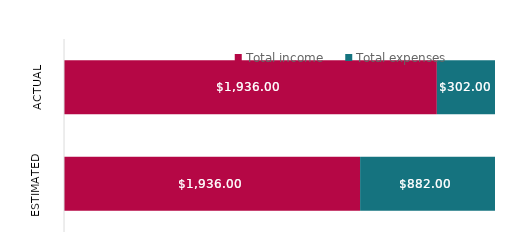
| Category | Total income | Total expenses |
|---|---|---|
| Estimated | 1936 | 882 |
| Actual | 1936 | 302 |